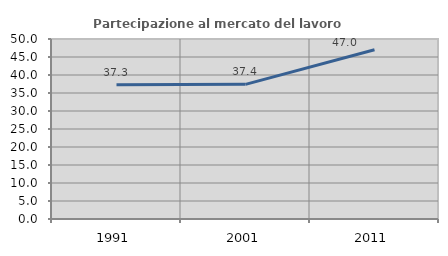
| Category | Partecipazione al mercato del lavoro  femminile |
|---|---|
| 1991.0 | 37.261 |
| 2001.0 | 37.4 |
| 2011.0 | 46.999 |